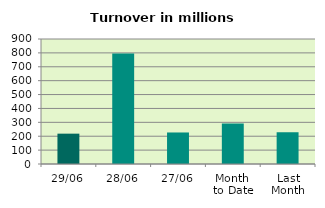
| Category | Series 0 |
|---|---|
| 29/06 | 218.463 |
| 28/06 | 794.86 |
| 27/06 | 226.964 |
| Month 
to Date | 291.626 |
| Last
Month | 228.645 |